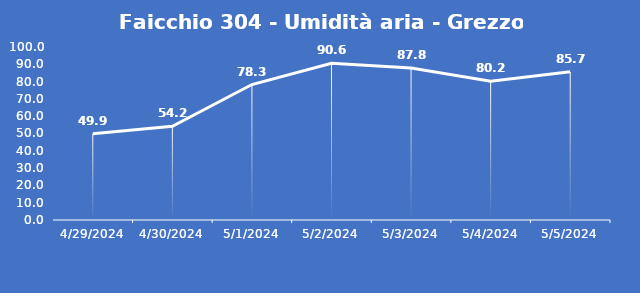
| Category | Faicchio 304 - Umidità aria - Grezzo (%) |
|---|---|
| 4/29/24 | 49.9 |
| 4/30/24 | 54.2 |
| 5/1/24 | 78.3 |
| 5/2/24 | 90.6 |
| 5/3/24 | 87.8 |
| 5/4/24 | 80.2 |
| 5/5/24 | 85.7 |